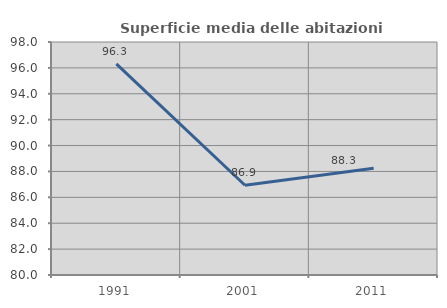
| Category | Superficie media delle abitazioni occupate |
|---|---|
| 1991.0 | 96.308 |
| 2001.0 | 86.935 |
| 2011.0 | 88.251 |